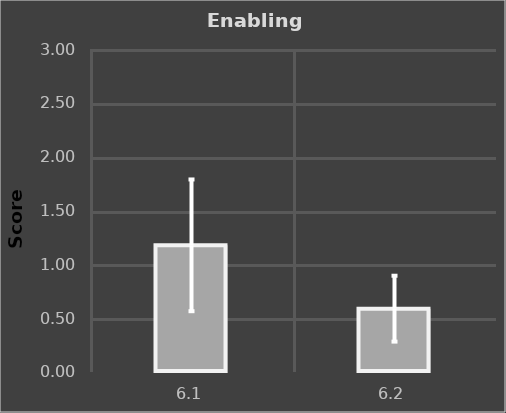
| Category | Male |
|---|---|
| 6.1 | 1.176 |
| 6.2 | 0.588 |